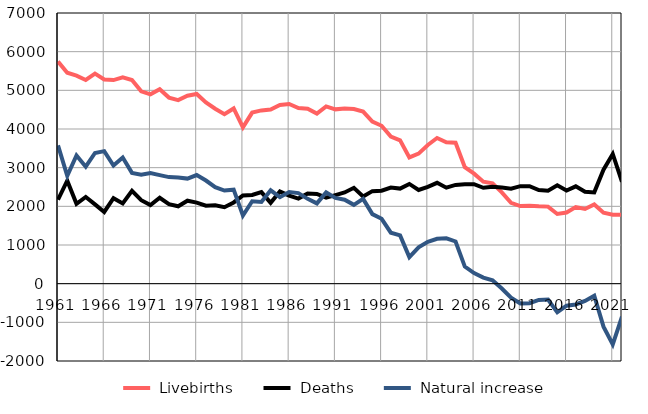
| Category |  Livebirths |  Deaths |  Natural increase |
|---|---|---|---|
| 1961.0 | 5747 | 2172 | 3575 |
| 1962.0 | 5454 | 2664 | 2790 |
| 1963.0 | 5380 | 2064 | 3316 |
| 1964.0 | 5267 | 2243 | 3024 |
| 1965.0 | 5432 | 2052 | 3380 |
| 1966.0 | 5282 | 1855 | 3427 |
| 1967.0 | 5266 | 2211 | 3055 |
| 1968.0 | 5337 | 2074 | 3263 |
| 1969.0 | 5268 | 2402 | 2866 |
| 1970.0 | 4974 | 2158 | 2816 |
| 1971.0 | 4896 | 2033 | 2863 |
| 1972.0 | 5028 | 2221 | 2807 |
| 1973.0 | 4812 | 2056 | 2756 |
| 1974.0 | 4748 | 2002 | 2746 |
| 1975.0 | 4862 | 2145 | 2717 |
| 1976.0 | 4906 | 2097 | 2809 |
| 1977.0 | 4685 | 2018 | 2667 |
| 1978.0 | 4524 | 2028 | 2496 |
| 1979.0 | 4385 | 1977 | 2408 |
| 1980.0 | 4531 | 2100 | 2431 |
| 1981.0 | 4043 | 2281 | 1762 |
| 1982.0 | 4424 | 2293 | 2131 |
| 1983.0 | 4481 | 2368 | 2113 |
| 1984.0 | 4503 | 2090 | 2413 |
| 1985.0 | 4619 | 2382 | 2237 |
| 1986.0 | 4646 | 2276 | 2370 |
| 1987.0 | 4542 | 2200 | 2342 |
| 1988.0 | 4526 | 2333 | 2193 |
| 1989.0 | 4398 | 2322 | 2076 |
| 1990.0 | 4583 | 2224 | 2359 |
| 1991.0 | 4508 | 2291 | 2217 |
| 1992.0 | 4530 | 2358 | 2172 |
| 1993.0 | 4517 | 2479 | 2038 |
| 1994.0 | 4449 | 2256 | 2193 |
| 1995.0 | 4191 | 2393 | 1798 |
| 1996.0 | 4083 | 2405 | 1678 |
| 1997.0 | 3806 | 2487 | 1319 |
| 1998.0 | 3708 | 2459 | 1249 |
| 1999.0 | 3265 | 2579 | 686 |
| 2000.0 | 3364 | 2424 | 940 |
| 2001.0 | 3588 | 2506 | 1082 |
| 2002.0 | 3767 | 2608 | 1159 |
| 2003.0 | 3657 | 2483 | 1174 |
| 2004.0 | 3644 | 2553 | 1091 |
| 2005.0 | 3013 | 2571 | 442 |
| 2006.0 | 2844 | 2571 | 273 |
| 2007.0 | 2637 | 2480 | 157 |
| 2008.0 | 2593 | 2507 | 86 |
| 2009.0 | 2361 | 2486 | -125 |
| 2010.0 | 2091 | 2456 | -365 |
| 2011.0 | 2008 | 2521 | -513 |
| 2012.0 | 2015 | 2521 | -506 |
| 2013.0 | 2001 | 2422 | -421 |
| 2014.0 | 1993 | 2404 | -411 |
| 2015.0 | 1803 | 2544 | -741 |
| 2016.0 | 1840 | 2410 | -570 |
| 2017.0 | 1980 | 2518 | -538 |
| 2018.0 | 1931 | 2378 | -447 |
| 2019.0 | 2050 | 2361 | -311 |
| 2020.0 | 1837 | 2948 | -1111 |
| 2021.0 | 1784 | 3355 | -1571 |
| 2022.0 | 1781 | 2635 | -854 |